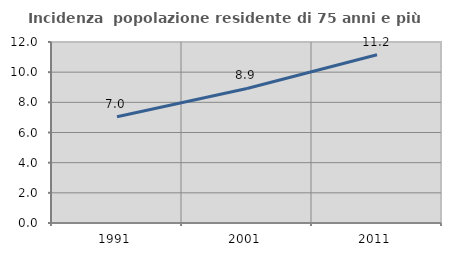
| Category | Incidenza  popolazione residente di 75 anni e più |
|---|---|
| 1991.0 | 7.044 |
| 2001.0 | 8.922 |
| 2011.0 | 11.159 |